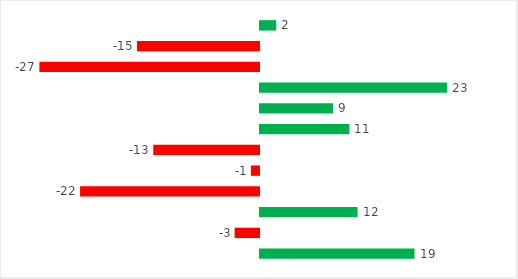
| Category | Series 0 |
|---|---|
| 0 | 19 |
| 1 | -3 |
| 2 | 12 |
| 3 | -22 |
| 4 | -1 |
| 5 | -13 |
| 6 | 11 |
| 7 | 9 |
| 8 | 23 |
| 9 | -27 |
| 10 | -15 |
| 11 | 2 |